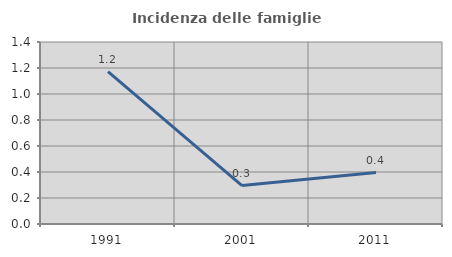
| Category | Incidenza delle famiglie numerose |
|---|---|
| 1991.0 | 1.171 |
| 2001.0 | 0.296 |
| 2011.0 | 0.396 |